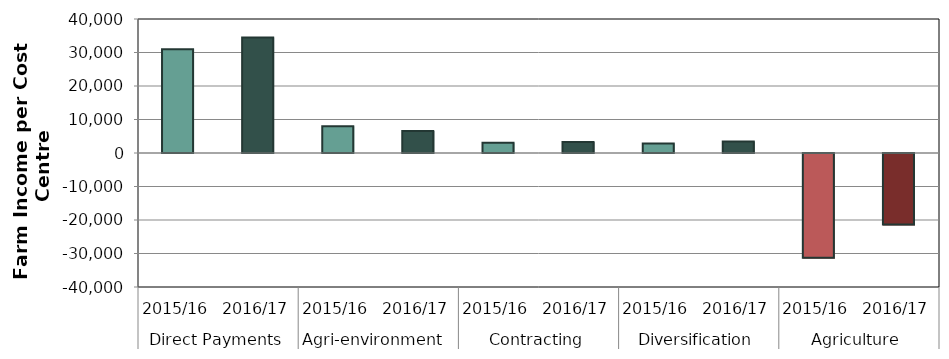
| Category | Series 2 |
|---|---|
| 0 | 30979.358 |
| 1 | 34482.7 |
| 2 | 7997.343 |
| 3 | 6539.8 |
| 4 | 3086.654 |
| 5 | 3273.8 |
| 6 | 2823.319 |
| 7 | 3435.8 |
| 8 | -31253.525 |
| 9 | -21329.8 |